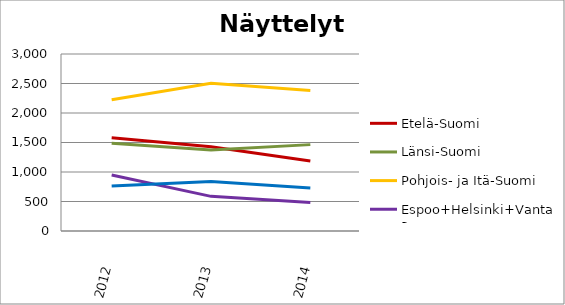
| Category | Etelä-Suomi | Länsi-Suomi | Pohjois- ja Itä-Suomi | Espoo+Helsinki+Vantaa | Muu Uusimaa |
|---|---|---|---|---|---|
| 2012.0 | 1580 | 1487 | 2225 | 950 | 761 |
| 2013.0 | 1429 | 1375 | 2505 | 587 | 837 |
| 2014.0 | 1186 | 1464 | 2382 | 485 | 728 |